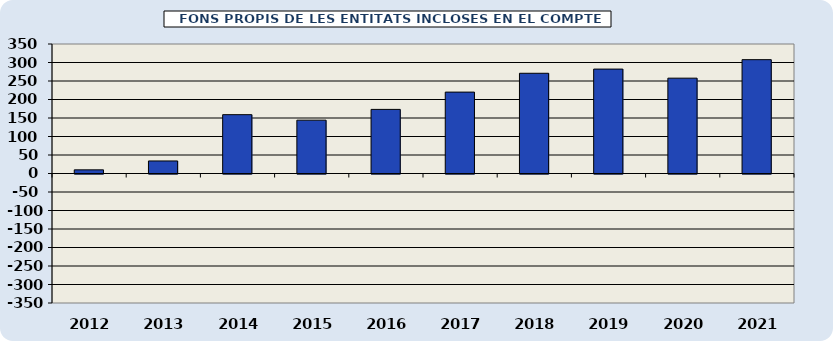
| Category | FONS PROPIS DE LES ENTITATS INCLOSES EN EL COMPTE GENERAL  |
|---|---|
| 2012.0 | 9.89 |
| 2013.0 | 33.89 |
| 2014.0 | 159.03 |
| 2015.0 | 144.16 |
| 2016.0 | 173.24 |
| 2017.0 | 219.98 |
| 2018.0 | 270.9 |
| 2019.0 | 282.19 |
| 2020.0 | 257.67 |
| 2021.0 | 307.65 |